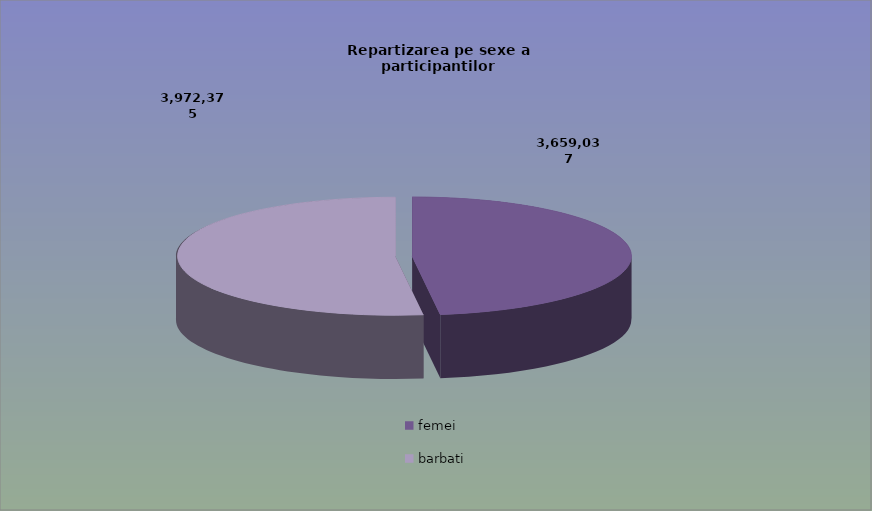
| Category | Series 0 |
|---|---|
| femei | 3659037 |
| barbati | 3972375 |